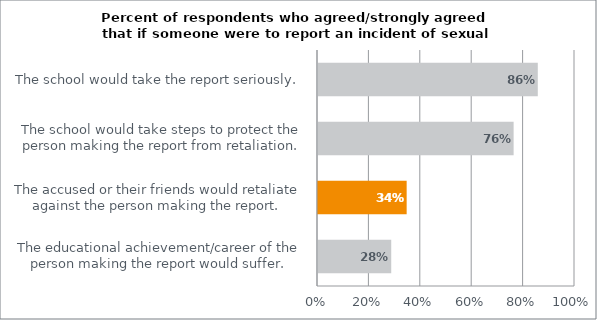
| Category | Series 0 |
|---|---|
| The educational achievement/career of the person making the report would suffer. | 0.285 |
| The accused or their friends would retaliate against the person making the report. | 0.345 |
| The school would take steps to protect the person making the report from retaliation. | 0.761 |
| The school would take the report seriously. | 0.855 |